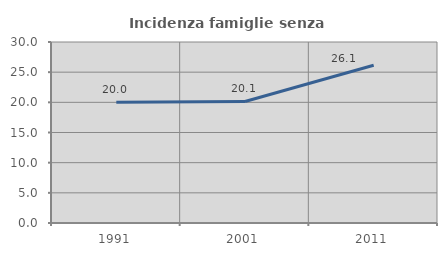
| Category | Incidenza famiglie senza nuclei |
|---|---|
| 1991.0 | 20.033 |
| 2001.0 | 20.147 |
| 2011.0 | 26.145 |